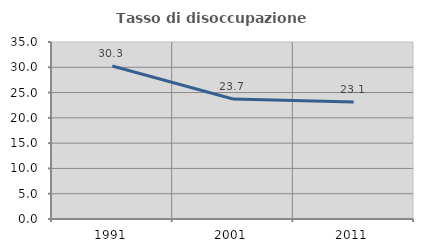
| Category | Tasso di disoccupazione giovanile  |
|---|---|
| 1991.0 | 30.252 |
| 2001.0 | 23.721 |
| 2011.0 | 23.121 |